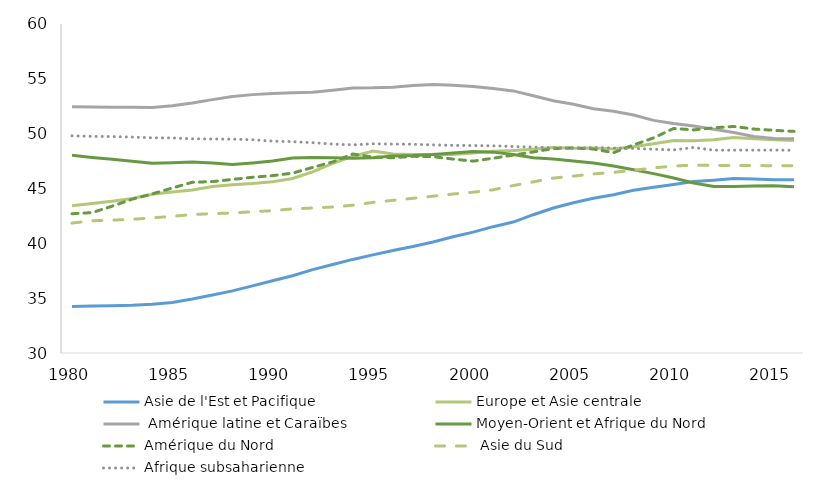
| Category | Asie de l'Est et Pacifique | Europe et Asie centrale |  Amérique latine et Caraïbes | Moyen-Orient et Afrique du Nord | Amérique du Nord |  Asie du Sud | Afrique subsaharienne |
|---|---|---|---|---|---|---|---|
| 1980.0 | 34.243 | 43.422 | 52.465 | 48.029 | 42.699 | 41.848 | 49.805 |
| 1981.0 | 34.283 | 43.624 | 52.428 | 47.829 | 42.801 | 42.059 | 49.754 |
| 1982.0 | 34.318 | 43.847 | 52.418 | 47.659 | 43.388 | 42.115 | 49.736 |
| 1983.0 | 34.345 | 44.086 | 52.407 | 47.489 | 44.027 | 42.191 | 49.686 |
| 1984.0 | 34.444 | 44.475 | 52.377 | 47.31 | 44.507 | 42.325 | 49.624 |
| 1985.0 | 34.614 | 44.681 | 52.537 | 47.359 | 45.048 | 42.46 | 49.611 |
| 1986.0 | 34.921 | 44.866 | 52.791 | 47.415 | 45.57 | 42.628 | 49.534 |
| 1987.0 | 35.282 | 45.188 | 53.102 | 47.334 | 45.629 | 42.705 | 49.51 |
| 1988.0 | 35.664 | 45.341 | 53.382 | 47.184 | 45.827 | 42.77 | 49.5 |
| 1989.0 | 36.118 | 45.448 | 53.56 | 47.331 | 46.024 | 42.884 | 49.445 |
| 1990.0 | 36.591 | 45.608 | 53.655 | 47.517 | 46.172 | 42.978 | 49.322 |
| 1991.0 | 37.045 | 45.91 | 53.72 | 47.775 | 46.402 | 43.14 | 49.268 |
| 1992.0 | 37.598 | 46.51 | 53.771 | 47.836 | 46.922 | 43.221 | 49.181 |
| 1993.0 | 38.071 | 47.294 | 53.965 | 47.796 | 47.423 | 43.313 | 49.049 |
| 1994.0 | 38.534 | 47.932 | 54.166 | 47.758 | 48.143 | 43.478 | 48.977 |
| 1995.0 | 38.944 | 48.422 | 54.176 | 47.803 | 47.864 | 43.735 | 49.075 |
| 1996.0 | 39.343 | 48.152 | 54.24 | 47.956 | 47.803 | 43.918 | 49.053 |
| 1997.0 | 39.705 | 48.09 | 54.392 | 47.999 | 47.934 | 44.107 | 49.033 |
| 1998.0 | 40.118 | 48.099 | 54.486 | 48.093 | 47.902 | 44.299 | 48.978 |
| 1999.0 | 40.602 | 48.103 | 54.42 | 48.238 | 47.682 | 44.498 | 48.929 |
| 2000.0 | 41.025 | 48.238 | 54.3 | 48.378 | 47.492 | 44.66 | 48.916 |
| 2001.0 | 41.519 | 48.387 | 54.11 | 48.316 | 47.763 | 44.881 | 48.893 |
| 2002.0 | 41.939 | 48.458 | 53.898 | 48.106 | 48.043 | 45.267 | 48.832 |
| 2003.0 | 42.61 | 48.584 | 53.458 | 47.804 | 48.333 | 45.604 | 48.782 |
| 2004.0 | 43.225 | 48.728 | 53.008 | 47.694 | 48.643 | 45.948 | 48.719 |
| 2005.0 | 43.706 | 48.674 | 52.682 | 47.501 | 48.694 | 46.132 | 48.695 |
| 2006.0 | 44.104 | 48.688 | 52.27 | 47.325 | 48.604 | 46.329 | 48.741 |
| 2007.0 | 44.433 | 48.602 | 52.034 | 47.053 | 48.263 | 46.473 | 48.691 |
| 2008.0 | 44.832 | 48.813 | 51.703 | 46.707 | 48.974 | 46.666 | 48.65 |
| 2009.0 | 45.106 | 49.085 | 51.213 | 46.355 | 49.614 | 46.874 | 48.58 |
| 2010.0 | 45.371 | 49.373 | 50.925 | 45.961 | 50.474 | 47.057 | 48.518 |
| 2011.0 | 45.636 | 49.364 | 50.692 | 45.509 | 50.343 | 47.128 | 48.741 |
| 2012.0 | 45.762 | 49.453 | 50.399 | 45.182 | 50.532 | 47.112 | 48.494 |
| 2013.0 | 45.914 | 49.648 | 50.114 | 45.193 | 50.661 | 47.095 | 48.497 |
| 2014.0 | 45.86 | 49.534 | 49.743 | 45.234 | 50.419 | 47.089 | 48.497 |
| 2015.0 | 45.799 | 49.439 | 49.562 | 45.247 | 50.309 | 47.083 | 48.504 |
| 2016.0 | 45.807 | 49.386 | 49.545 | 45.153 | 50.208 | 47.077 | 48.483 |